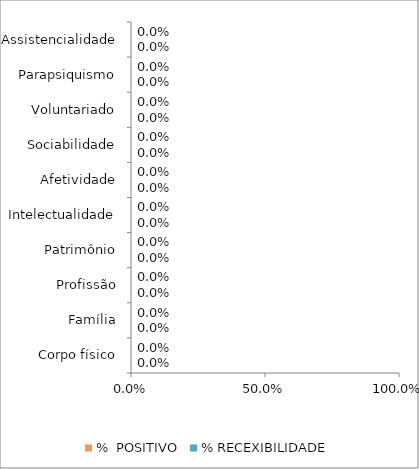
| Category | %  POSITIVO | % RECEXIBILIDADE |
|---|---|---|
| Corpo físico | 0 | 0 |
| Família | 0 | 0 |
| Profissão | 0 | 0 |
| Patrimônio | 0 | 0 |
| Intelectualidade | 0 | 0 |
| Afetividade | 0 | 0 |
| Sociabilidade | 0 | 0 |
| Voluntariado | 0 | 0 |
| Parapsiquismo | 0 | 0 |
| Assistencialidade | 0 | 0 |